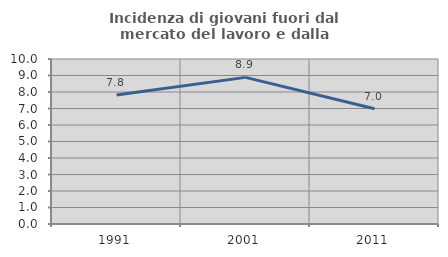
| Category | Incidenza di giovani fuori dal mercato del lavoro e dalla formazione  |
|---|---|
| 1991.0 | 7.815 |
| 2001.0 | 8.886 |
| 2011.0 | 6.99 |